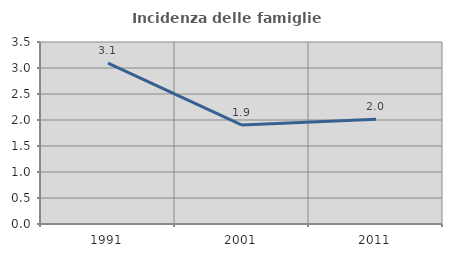
| Category | Incidenza delle famiglie numerose |
|---|---|
| 1991.0 | 3.092 |
| 2001.0 | 1.902 |
| 2011.0 | 2.016 |